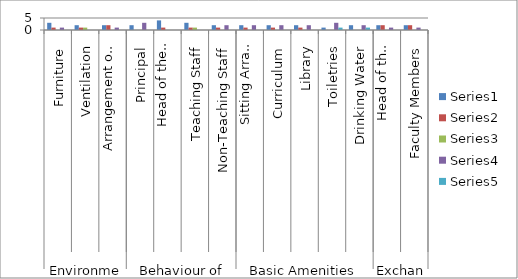
| Category | Series 0 | Series 1 | Series 2 | Series 3 | Series 4 |
|---|---|---|---|---|---|
| 0 | 3 | 1 | 0 | 1 | 0 |
| 1 | 2 | 1 | 1 | 0 | 0 |
| 2 | 2 | 2 | 0 | 1 | 0 |
| 3 | 2 | 0 | 0 | 3 | 0 |
| 4 | 4 | 1 | 0 | 0 | 0 |
| 5 | 3 | 1 | 1 | 0 | 0 |
| 6 | 2 | 1 | 0 | 2 | 0 |
| 7 | 2 | 1 | 0 | 2 | 0 |
| 8 | 2 | 1 | 0 | 2 | 0 |
| 9 | 2 | 1 | 0 | 2 | 0 |
| 10 | 1 | 0 | 0 | 3 | 1 |
| 11 | 2 | 0 | 0 | 2 | 1 |
| 12 | 2 | 2 | 0 | 1 | 0 |
| 13 | 2 | 2 | 0 | 1 | 0 |